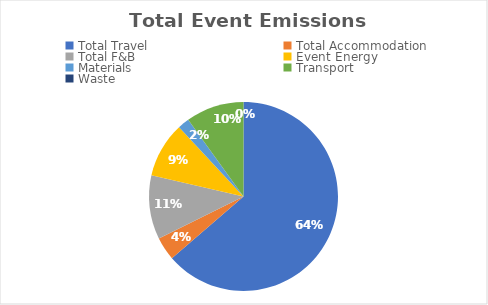
| Category | Series 0 |
|---|---|
| Total Travel | 1.28 |
| Total Accommodation | 0.08 |
| Total F&B | 0.22 |
| Event Energy | 0.19 |
| Materials | 0.04 |
| Transport | 0.2 |
| Waste | 0 |